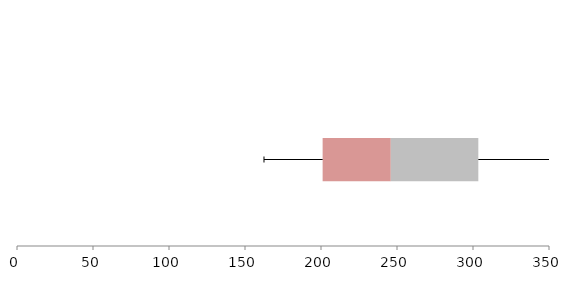
| Category | Series 1 | Series 2 | Series 3 |
|---|---|---|---|
| 0 | 201.07 | 44.851 | 57.584 |